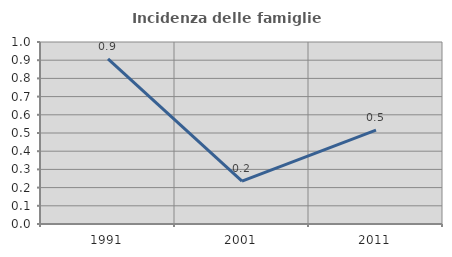
| Category | Incidenza delle famiglie numerose |
|---|---|
| 1991.0 | 0.907 |
| 2001.0 | 0.235 |
| 2011.0 | 0.515 |